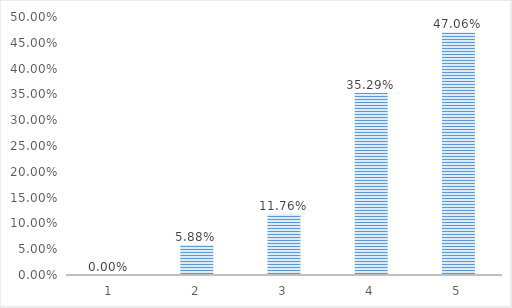
| Category | Series 0 |
|---|---|
| 1.0 | 0 |
| 2.0 | 0.059 |
| 3.0 | 0.118 |
| 4.0 | 0.353 |
| 5.0 | 0.471 |